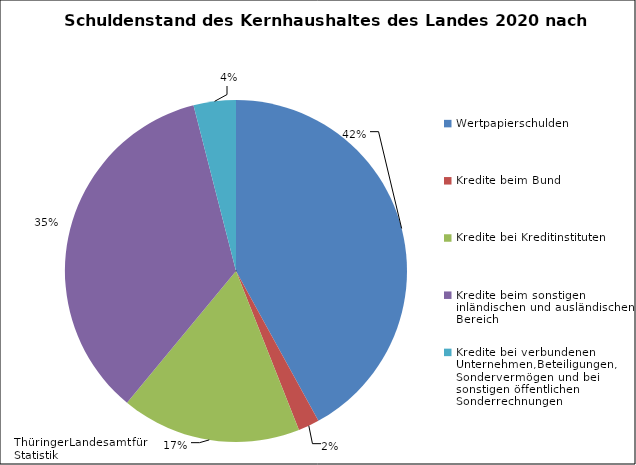
| Category | Series 0 | Wertpapierschulden |
|---|---|---|
| Wertpapierschulden | 0.42 |  |
| Kredite beim Bund | 0.02 |  |
| Kredite bei Kreditinstituten | 0.17 |  |
| Kredite beim sonstigen inländischen und ausländischen Bereich | 0.35 |  |
| Kredite bei verbundenen Unternehmen,Beteiligungen, Sondervermögen und bei sonstigen öffentlichen Sonderrechnungen | 0.04 |  |